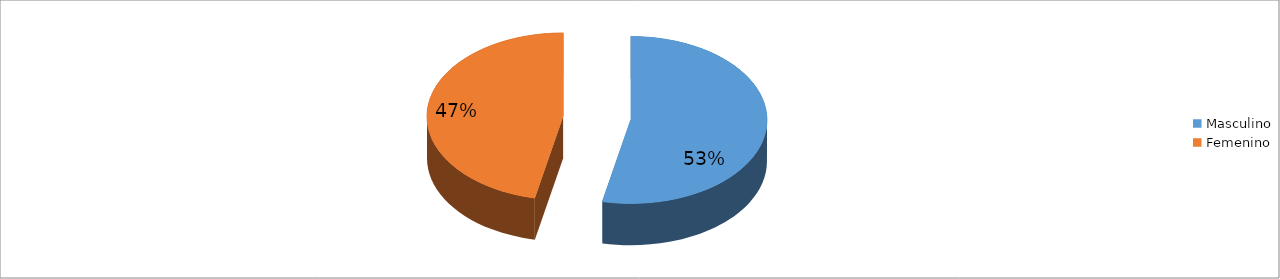
| Category | Series 0 |
|---|---|
| Masculino | 0.533 |
| Femenino | 0.467 |